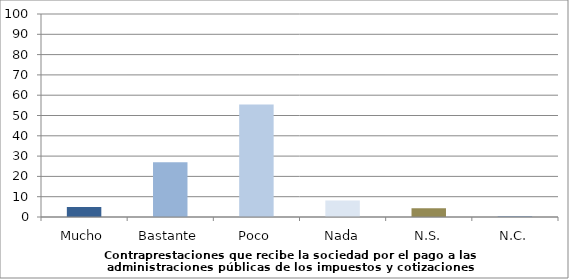
| Category | Series 0 |
|---|---|
| Mucho | 4.9 |
| Bastante | 27 |
| Poco | 55.4 |
| Nada | 8.1 |
| N.S. | 4.3 |
| N.C. | 0.3 |